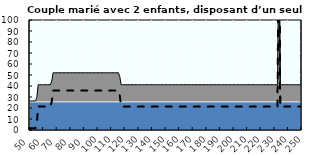
| Category | Coin fiscal marginal (somme des composantes) | Taux d’imposition marginal net |
|---|---|---|
| 50.0 | 26.457 | 1.6 |
| 51.0 | 26.457 | 1.6 |
| 52.0 | 26.457 | 1.6 |
| 53.0 | 26.457 | 1.6 |
| 54.0 | 26.457 | 1.6 |
| 55.0 | 29.489 | 5.656 |
| 56.0 | 41.166 | 21.28 |
| 57.0 | 41.166 | 21.28 |
| 58.0 | 41.166 | 21.28 |
| 59.0 | 41.166 | 21.28 |
| 60.0 | 41.166 | 21.28 |
| 61.0 | 41.166 | 21.28 |
| 62.0 | 41.166 | 21.28 |
| 63.0 | 41.166 | 21.28 |
| 64.0 | 41.166 | 21.28 |
| 65.0 | 41.166 | 21.28 |
| 66.0 | 44.624 | 25.907 |
| 67.0 | 52.028 | 35.813 |
| 68.0 | 52.028 | 35.813 |
| 69.0 | 52.028 | 35.813 |
| 70.0 | 52.028 | 35.813 |
| 71.0 | 52.028 | 35.813 |
| 72.0 | 52.028 | 35.813 |
| 73.0 | 52.028 | 35.813 |
| 74.0 | 52.028 | 35.813 |
| 75.0 | 52.028 | 35.813 |
| 76.0 | 52.028 | 35.813 |
| 77.0 | 52.028 | 35.813 |
| 78.0 | 52.028 | 35.813 |
| 79.0 | 52.028 | 35.813 |
| 80.0 | 52.028 | 35.813 |
| 81.0 | 52.028 | 35.813 |
| 82.0 | 52.028 | 35.813 |
| 83.0 | 52.028 | 35.813 |
| 84.0 | 52.028 | 35.813 |
| 85.0 | 52.028 | 35.813 |
| 86.0 | 52.028 | 35.813 |
| 87.0 | 52.028 | 35.813 |
| 88.0 | 52.028 | 35.813 |
| 89.0 | 52.028 | 35.813 |
| 90.0 | 52.028 | 35.813 |
| 91.0 | 52.028 | 35.813 |
| 92.0 | 52.028 | 35.813 |
| 93.0 | 52.028 | 35.813 |
| 94.0 | 52.028 | 35.813 |
| 95.0 | 52.028 | 35.813 |
| 96.0 | 52.028 | 35.813 |
| 97.0 | 52.028 | 35.813 |
| 98.0 | 52.028 | 35.813 |
| 99.0 | 52.028 | 35.813 |
| 100.0 | 52.028 | 35.813 |
| 101.0 | 52.028 | 35.813 |
| 102.0 | 52.028 | 35.813 |
| 103.0 | 52.028 | 35.813 |
| 104.0 | 52.028 | 35.813 |
| 105.0 | 52.028 | 35.813 |
| 106.0 | 52.028 | 35.813 |
| 107.0 | 52.028 | 35.813 |
| 108.0 | 52.028 | 35.813 |
| 109.0 | 52.028 | 35.813 |
| 110.0 | 52.028 | 35.813 |
| 111.0 | 52.028 | 35.813 |
| 112.0 | 52.028 | 35.813 |
| 113.0 | 52.028 | 35.813 |
| 114.0 | 52.028 | 35.813 |
| 115.0 | 52.028 | 35.813 |
| 116.0 | 48.692 | 31.35 |
| 117.0 | 41.166 | 21.28 |
| 118.0 | 41.166 | 21.28 |
| 119.0 | 41.166 | 21.28 |
| 120.0 | 41.166 | 21.28 |
| 121.0 | 41.166 | 21.28 |
| 122.0 | 41.166 | 21.28 |
| 123.0 | 41.166 | 21.28 |
| 124.0 | 41.166 | 21.28 |
| 125.0 | 41.166 | 21.28 |
| 126.0 | 41.166 | 21.28 |
| 127.0 | 41.166 | 21.28 |
| 128.0 | 41.166 | 21.28 |
| 129.0 | 41.166 | 21.28 |
| 130.0 | 41.166 | 21.28 |
| 131.0 | 41.166 | 21.28 |
| 132.0 | 41.166 | 21.28 |
| 133.0 | 41.166 | 21.28 |
| 134.0 | 41.166 | 21.28 |
| 135.0 | 41.166 | 21.28 |
| 136.0 | 41.166 | 21.28 |
| 137.0 | 41.166 | 21.28 |
| 138.0 | 41.166 | 21.28 |
| 139.0 | 41.166 | 21.28 |
| 140.0 | 41.166 | 21.28 |
| 141.0 | 41.166 | 21.28 |
| 142.0 | 41.166 | 21.28 |
| 143.0 | 41.166 | 21.28 |
| 144.0 | 41.166 | 21.28 |
| 145.0 | 41.166 | 21.28 |
| 146.0 | 41.166 | 21.28 |
| 147.0 | 41.166 | 21.28 |
| 148.0 | 41.166 | 21.28 |
| 149.0 | 41.166 | 21.28 |
| 150.0 | 41.166 | 21.28 |
| 151.0 | 41.166 | 21.28 |
| 152.0 | 41.166 | 21.28 |
| 153.0 | 41.166 | 21.28 |
| 154.0 | 41.166 | 21.28 |
| 155.0 | 41.166 | 21.28 |
| 156.0 | 41.166 | 21.28 |
| 157.0 | 41.166 | 21.28 |
| 158.0 | 41.166 | 21.28 |
| 159.0 | 41.166 | 21.28 |
| 160.0 | 41.166 | 21.28 |
| 161.0 | 41.166 | 21.28 |
| 162.0 | 41.166 | 21.28 |
| 163.0 | 41.166 | 21.28 |
| 164.0 | 41.166 | 21.28 |
| 165.0 | 41.166 | 21.28 |
| 166.0 | 41.166 | 21.28 |
| 167.0 | 41.166 | 21.28 |
| 168.0 | 41.166 | 21.28 |
| 169.0 | 41.166 | 21.28 |
| 170.0 | 41.166 | 21.28 |
| 171.0 | 41.166 | 21.28 |
| 172.0 | 41.166 | 21.28 |
| 173.0 | 41.166 | 21.28 |
| 174.0 | 41.166 | 21.28 |
| 175.0 | 41.166 | 21.28 |
| 176.0 | 41.166 | 21.28 |
| 177.0 | 41.166 | 21.28 |
| 178.0 | 41.166 | 21.28 |
| 179.0 | 41.166 | 21.28 |
| 180.0 | 41.166 | 21.28 |
| 181.0 | 41.166 | 21.28 |
| 182.0 | 41.166 | 21.28 |
| 183.0 | 41.166 | 21.28 |
| 184.0 | 41.166 | 21.28 |
| 185.0 | 41.166 | 21.28 |
| 186.0 | 41.166 | 21.28 |
| 187.0 | 41.166 | 21.28 |
| 188.0 | 41.166 | 21.28 |
| 189.0 | 41.166 | 21.28 |
| 190.0 | 41.166 | 21.28 |
| 191.0 | 41.166 | 21.28 |
| 192.0 | 41.166 | 21.28 |
| 193.0 | 41.166 | 21.28 |
| 194.0 | 41.166 | 21.28 |
| 195.0 | 41.166 | 21.28 |
| 196.0 | 41.166 | 21.28 |
| 197.0 | 41.166 | 21.28 |
| 198.0 | 41.166 | 21.28 |
| 199.0 | 41.166 | 21.28 |
| 200.0 | 41.166 | 21.28 |
| 201.0 | 41.166 | 21.28 |
| 202.0 | 41.166 | 21.28 |
| 203.0 | 41.166 | 21.28 |
| 204.0 | 41.166 | 21.28 |
| 205.0 | 41.166 | 21.28 |
| 206.0 | 41.166 | 21.28 |
| 207.0 | 41.166 | 21.28 |
| 208.0 | 41.166 | 21.28 |
| 209.0 | 41.166 | 21.28 |
| 210.0 | 41.166 | 21.28 |
| 211.0 | 41.166 | 21.28 |
| 212.0 | 41.166 | 21.28 |
| 213.0 | 41.166 | 21.28 |
| 214.0 | 41.166 | 21.28 |
| 215.0 | 41.166 | 21.28 |
| 216.0 | 41.166 | 21.28 |
| 217.0 | 41.166 | 21.28 |
| 218.0 | 41.166 | 21.28 |
| 219.0 | 41.166 | 21.28 |
| 220.0 | 41.166 | 21.28 |
| 221.0 | 41.166 | 21.28 |
| 222.0 | 41.166 | 21.28 |
| 223.0 | 41.166 | 21.28 |
| 224.0 | 41.166 | 21.28 |
| 225.0 | 41.166 | 21.28 |
| 226.0 | 41.166 | 21.28 |
| 227.0 | 41.166 | 21.28 |
| 228.0 | 41.166 | 21.28 |
| 229.0 | 41.166 | 21.28 |
| 230.0 | 41.166 | 21.28 |
| 231.0 | 41.166 | 21.28 |
| 232.0 | 41.166 | 21.28 |
| 233.0 | 190.676 | 221.325 |
| 234.0 | 41.166 | 21.28 |
| 235.0 | 41.166 | 21.28 |
| 236.0 | 41.166 | 21.28 |
| 237.0 | 41.166 | 21.28 |
| 238.0 | 41.166 | 21.28 |
| 239.0 | 41.166 | 21.28 |
| 240.0 | 41.166 | 21.28 |
| 241.0 | 41.166 | 21.28 |
| 242.0 | 41.166 | 21.28 |
| 243.0 | 41.166 | 21.28 |
| 244.0 | 41.166 | 21.28 |
| 245.0 | 41.166 | 21.28 |
| 246.0 | 41.166 | 21.28 |
| 247.0 | 41.166 | 21.28 |
| 248.0 | 41.166 | 21.28 |
| 249.0 | 41.166 | 21.28 |
| 250.0 | 41.166 | 21.28 |